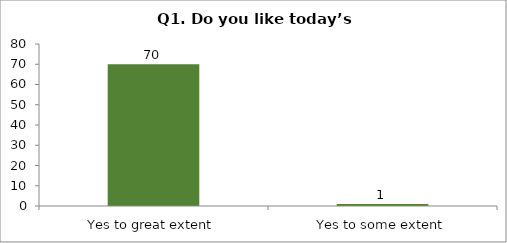
| Category | Q1. Do you like today’s session? |
|---|---|
| Yes to great extent | 70 |
| Yes to some extent | 1 |